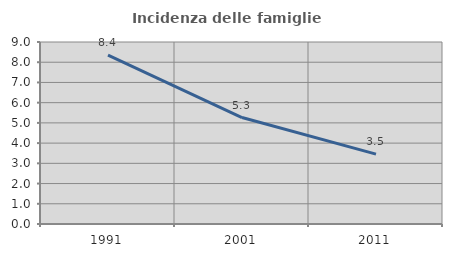
| Category | Incidenza delle famiglie numerose |
|---|---|
| 1991.0 | 8.35 |
| 2001.0 | 5.263 |
| 2011.0 | 3.457 |